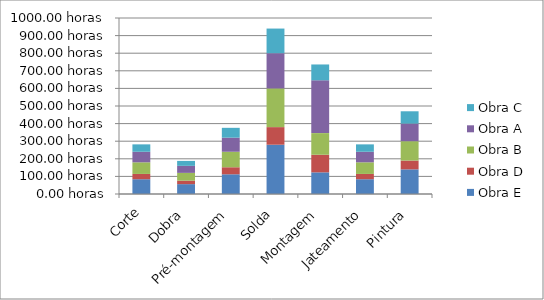
| Category | Obra E | Obra D | Obra B | Obra A | Obra C |
|---|---|---|---|---|---|
| Corte | 84 | 30 | 66 | 60 | 42 |
| Dobra | 56 | 20 | 44 | 40 | 28 |
| Pré-montagem | 112 | 40 | 88 | 80 | 56 |
| Solda | 280 | 100 | 220 | 200 | 140 |
| Montagem | 123 | 100 | 123 | 300 | 90 |
| Jateamento | 84 | 30 | 66 | 60 | 42 |
| Pintura | 140 | 50 | 110 | 100 | 70 |